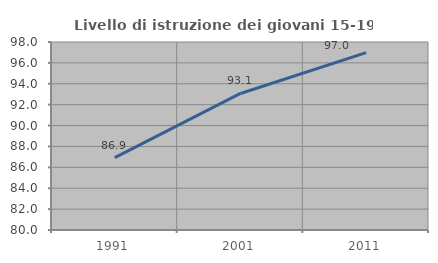
| Category | Livello di istruzione dei giovani 15-19 anni |
|---|---|
| 1991.0 | 86.93 |
| 2001.0 | 93.074 |
| 2011.0 | 96.988 |